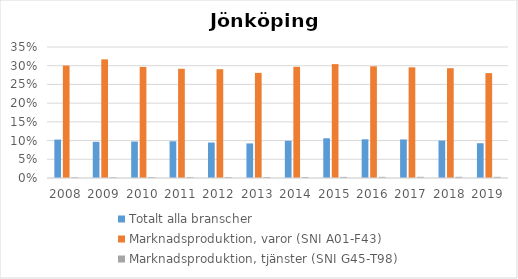
| Category | Totalt alla branscher | Marknadsproduktion, varor (SNI A01-F43) | Marknadsproduktion, tjänster (SNI G45-T98) |
|---|---|---|---|
| 2008 | 0.103 | 0.3 | 0.002 |
| 2009 | 0.097 | 0.317 | 0.002 |
| 2010 | 0.097 | 0.297 | 0.002 |
| 2011 | 0.098 | 0.292 | 0.002 |
| 2012 | 0.095 | 0.291 | 0.002 |
| 2013 | 0.092 | 0.281 | 0.003 |
| 2014 | 0.099 | 0.297 | 0.003 |
| 2015 | 0.106 | 0.304 | 0.003 |
| 2016 | 0.103 | 0.298 | 0.003 |
| 2017 | 0.103 | 0.296 | 0.003 |
| 2018 | 0.1 | 0.293 | 0.003 |
| 2019 | 0.093 | 0.28 | 0.003 |